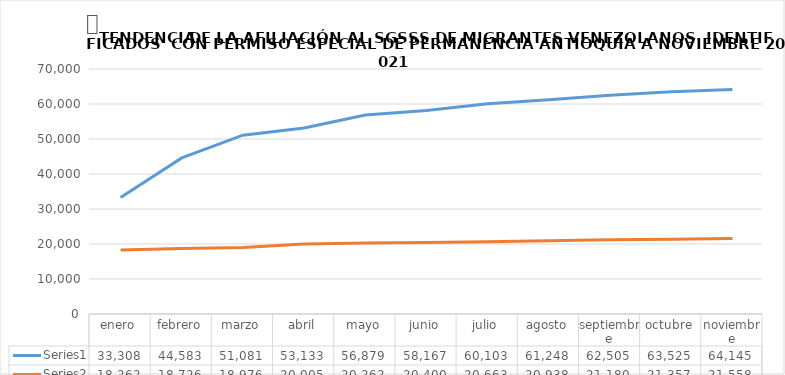
| Category | Series 0 | Series 1 |
|---|---|---|
| enero | 33308 | 18262 |
| febrero | 44583 | 18726 |
| marzo | 51081 | 18976 |
| abril | 53133 | 20005 |
| mayo | 56879 | 20262 |
| junio | 58167 | 20400 |
| julio | 60103 | 20663 |
| agosto | 61248 | 20938 |
| septiembre | 62505 | 21180 |
| octubre | 63525 | 21357 |
| noviembre | 64145 | 21558 |